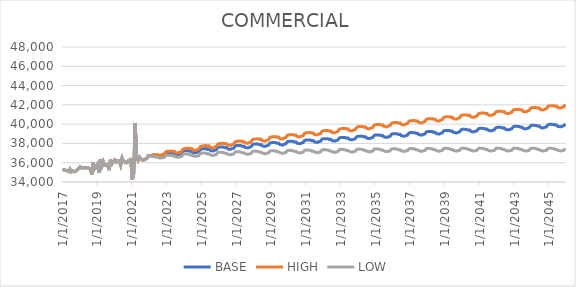
| Category | BASE | HIGH | LOW |
|---|---|---|---|
| 1/1/17 | 35227 | 35227 | 35227 |
| 2/1/17 | 35260 | 35260 | 35260 |
| 3/1/17 | 35215 | 35215 | 35215 |
| 4/1/17 | 35169 | 35169 | 35169 |
| 5/1/17 | 35095 | 35095 | 35095 |
| 6/1/17 | 35328 | 35328 | 35328 |
| 7/1/17 | 35048 | 35048 | 35048 |
| 8/1/17 | 35148 | 35148 | 35148 |
| 9/1/17 | 35068 | 35068 | 35068 |
| 10/1/17 | 35120 | 35120 | 35120 |
| 11/1/17 | 35263 | 35263 | 35263 |
| 12/1/17 | 35378 | 35378 | 35378 |
| 1/1/18 | 35564 | 35564 | 35564 |
| 2/1/18 | 35449 | 35449 | 35449 |
| 3/1/18 | 35502 | 35502 | 35502 |
| 4/1/18 | 35459 | 35459 | 35459 |
| 5/1/18 | 35483 | 35483 | 35483 |
| 6/1/18 | 35495 | 35495 | 35495 |
| 7/1/18 | 35414 | 35414 | 35414 |
| 8/1/18 | 35382 | 35382 | 35382 |
| 9/1/18 | 34801 | 34801 | 34801 |
| 10/1/18 | 36027 | 36027 | 36027 |
| 11/1/18 | 35402 | 35402 | 35402 |
| 12/1/18 | 35638.182 | 35638.182 | 35638.182 |
| 1/1/19 | 35852 | 35852 | 35852 |
| 2/1/19 | 34946 | 34946 | 34946 |
| 3/1/19 | 36319 | 36319 | 36319 |
| 4/1/19 | 35680 | 35680 | 35680 |
| 5/1/19 | 36109 | 36109 | 36109 |
| 6/1/19 | 35726 | 35726 | 35726 |
| 7/1/19 | 35770 | 35770 | 35770 |
| 8/1/19 | 35795 | 35795 | 35795 |
| 9/1/19 | 35242 | 35242 | 35242 |
| 10/1/19 | 36323 | 36323 | 36323 |
| 11/1/19 | 35881 | 35881 | 35881 |
| 12/1/19 | 36100 | 36100 | 36100 |
| 1/1/20 | 36288 | 36288 | 36288 |
| 2/1/20 | 36073 | 36073 | 36073 |
| 3/1/20 | 36222 | 36222 | 36222 |
| 4/1/20 | 36205 | 36205 | 36205 |
| 5/1/20 | 35754 | 35754 | 35754 |
| 6/1/20 | 36479 | 36479 | 36479 |
| 7/1/20 | 36156 | 36156 | 36156 |
| 8/1/20 | 36067 | 36067 | 36067 |
| 9/1/20 | 35987 | 35987 | 35987 |
| 10/1/20 | 36154 | 36154 | 36154 |
| 11/1/20 | 36080 | 36080 | 36080 |
| 12/1/20 | 36480 | 36480 | 36480 |
| 1/1/21 | 34267 | 34267 | 34267 |
| 2/1/21 | 34820 | 34820 | 34820 |
| 3/1/21 | 40112 | 40112 | 40112 |
| 4/1/21 | 36559 | 36559 | 36559 |
| 5/1/21 | 36244 | 36244 | 36244 |
| 6/1/21 | 36578 | 36578 | 36578 |
| 7/1/21 | 36397 | 36397 | 36397 |
| 8/1/21 | 36290 | 36290 | 36290 |
| 9/1/21 | 36292 | 36292 | 36292 |
| 10/1/21 | 36376 | 36376 | 36376 |
| 11/1/21 | 36425 | 36425 | 36425 |
| 12/1/21 | 36745 | 36745 | 36745 |
| 1/1/22 | 36719.5 | 36719.5 | 36719.5 |
| 2/1/22 | 36727.5 | 36727.5 | 36727.5 |
| 3/1/22 | 36744.028 | 36818.098 | 36633.551 |
| 4/1/22 | 36771.654 | 36854.176 | 36648.666 |
| 5/1/22 | 36710.391 | 36801.023 | 36575.361 |
| 6/1/22 | 36754.42 | 36853.437 | 36606.942 |
| 7/1/22 | 36687.809 | 36794.928 | 36528.322 |
| 8/1/22 | 36652.628 | 36767.902 | 36481.031 |
| 9/1/22 | 36660.186 | 36783.818 | 36476.26 |
| 10/1/22 | 36744.545 | 36876.848 | 36547.808 |
| 11/1/22 | 36741.983 | 36882.36 | 36533.27 |
| 12/1/22 | 36939.43 | 37088.857 | 36717.32 |
| 1/1/23 | 37032.223 | 37190.424 | 36797.174 |
| 2/1/23 | 37021.006 | 37187.327 | 36773.901 |
| 3/1/23 | 37029.04 | 37203.759 | 36769.553 |
| 4/1/23 | 37033.798 | 37217.099 | 36761.723 |
| 5/1/23 | 36986.946 | 37178.381 | 36702.899 |
| 6/1/23 | 36989.152 | 37188.872 | 36692.875 |
| 7/1/23 | 36871.953 | 37047.652 | 36616.903 |
| 8/1/23 | 36847.351 | 37031.29 | 36580.147 |
| 9/1/23 | 36847.26 | 37039.643 | 36567.676 |
| 10/1/23 | 36911.061 | 37112.27 | 36618.539 |
| 11/1/23 | 36945.61 | 37155.094 | 36640.868 |
| 12/1/23 | 37165.289 | 37384.466 | 36846.355 |
| 1/1/24 | 37232.916 | 37460.927 | 36901 |
| 2/1/24 | 37235.854 | 37472.038 | 36891.858 |
| 3/1/24 | 37250.831 | 37495.616 | 36894.244 |
| 4/1/24 | 37250.935 | 37504.528 | 36881.524 |
| 5/1/24 | 37174.493 | 37435.843 | 36793.695 |
| 6/1/24 | 37212.734 | 37482.89 | 36819.087 |
| 7/1/24 | 37062.805 | 37308.607 | 36710.901 |
| 8/1/24 | 37049.674 | 37303.912 | 36685.417 |
| 9/1/24 | 37023.465 | 37285.869 | 36647.289 |
| 10/1/24 | 37100.723 | 37372.388 | 36711.078 |
| 11/1/24 | 37146.306 | 37426.423 | 36744.272 |
| 12/1/24 | 37380.976 | 37671.503 | 36963.82 |
| 1/1/25 | 37421.432 | 37720.583 | 36991.624 |
| 2/1/25 | 37447.683 | 37755.327 | 37005.421 |
| 3/1/25 | 37445.571 | 37761.686 | 36990.956 |
| 4/1/25 | 37464.74 | 37790.256 | 36996.595 |
| 5/1/25 | 37375.501 | 37708.472 | 36896.438 |
| 6/1/25 | 37423.503 | 37765.651 | 36931.182 |
| 7/1/25 | 37263.507 | 37581.061 | 36813.327 |
| 8/1/25 | 37236.45 | 37562.275 | 36774.198 |
| 9/1/25 | 37214.509 | 37548.547 | 36740.349 |
| 10/1/25 | 37303.263 | 37647.092 | 36814.998 |
| 11/1/25 | 37337.478 | 37689.559 | 36837.124 |
| 12/1/25 | 37556.332 | 37919.051 | 37040.611 |
| 1/1/26 | 37612.472 | 37984.245 | 37083.562 |
| 2/1/26 | 37621.225 | 38001.187 | 37080.325 |
| 3/1/26 | 37616.289 | 38004.73 | 37063.091 |
| 4/1/26 | 37624.352 | 38022.301 | 37057.563 |
| 5/1/26 | 37556.158 | 37961.865 | 36978.129 |
| 6/1/26 | 37574.251 | 37988.671 | 36983.651 |
| 7/1/26 | 37431.179 | 37821.307 | 36882.403 |
| 8/1/26 | 37400.078 | 37798.387 | 36839.407 |
| 9/1/26 | 37394.149 | 37801.042 | 36821.163 |
| 10/1/26 | 37472.043 | 37888.825 | 36884.883 |
| 11/1/26 | 37499.036 | 37923.887 | 36900.082 |
| 12/1/26 | 37714.155 | 38150.028 | 37099.373 |
| 1/1/27 | 37781.001 | 38226.377 | 37152.492 |
| 2/1/27 | 37778.103 | 38231.341 | 37138.083 |
| 3/1/27 | 37778.957 | 38240.898 | 37126.418 |
| 4/1/27 | 37777.115 | 38248.617 | 37110.998 |
| 5/1/27 | 37703.852 | 38182.885 | 37026.868 |
| 6/1/27 | 37719.971 | 38207.75 | 37030.45 |
| 7/1/27 | 37578.934 | 38042.424 | 36931.308 |
| 8/1/27 | 37554.812 | 38026.672 | 36895.106 |
| 9/1/27 | 37542.86 | 38023.195 | 36871.064 |
| 10/1/27 | 37616.749 | 38107.142 | 36930.619 |
| 11/1/27 | 37653.811 | 38152.505 | 36955.626 |
| 12/1/27 | 37877.836 | 38388.289 | 37162.916 |
| 1/1/28 | 37932.898 | 38452.71 | 37204.479 |
| 2/1/28 | 37938.849 | 38466.729 | 37198.711 |
| 3/1/28 | 37937.85 | 38474.477 | 37185.204 |
| 4/1/28 | 37937.918 | 38484.424 | 37171.353 |
| 5/1/28 | 37854.704 | 38408.32 | 37077.902 |
| 6/1/28 | 37886.785 | 38449.711 | 37096.788 |
| 7/1/28 | 37732.761 | 38270.974 | 36985.294 |
| 8/1/28 | 37709.651 | 38256.267 | 36950.119 |
| 9/1/28 | 37690.696 | 38245.563 | 36919.442 |
| 10/1/28 | 37770.574 | 38335.991 | 36984.411 |
| 11/1/28 | 37807.629 | 38381.348 | 37009.458 |
| 12/1/28 | 38030.687 | 38616.638 | 37215.219 |
| 1/1/29 | 38079.626 | 38674.911 | 37250.743 |
| 2/1/29 | 38088.625 | 38692.038 | 37248 |
| 3/1/29 | 38081.561 | 38693.585 | 37228.67 |
| 4/1/29 | 38086.691 | 38709.044 | 37219.385 |
| 5/1/29 | 38003.438 | 38632.754 | 37126.158 |
| 6/1/29 | 38032.544 | 38671.193 | 37142.114 |
| 7/1/29 | 37879.501 | 38493.375 | 37031.741 |
| 8/1/29 | 37853.398 | 38475.556 | 36993.802 |
| 9/1/29 | 37838.446 | 38469.009 | 36967.012 |
| 10/1/29 | 37918.325 | 38559.768 | 37031.621 |
| 11/1/29 | 37949.375 | 38598.882 | 37051.017 |
| 12/1/29 | 38165.428 | 38827.39 | 37249.542 |
| 1/1/30 | 38221.568 | 38893.281 | 37291.774 |
| 2/1/30 | 38223.552 | 38903.099 | 37282.451 |
| 3/1/30 | 38218.508 | 38906.775 | 37265.07 |
| 4/1/30 | 38217.61 | 38916.246 | 37249.788 |
| 5/1/30 | 38141.383 | 38847.095 | 37163.513 |
| 6/1/30 | 38158.472 | 38873.16 | 37167.998 |
| 7/1/30 | 38013.441 | 38703.573 | 37065.423 |
| 8/1/30 | 37986.328 | 38684.717 | 37026.572 |
| 9/1/30 | 37975.38 | 38682.36 | 37003.627 |
| 10/1/30 | 38053.26 | 38771.333 | 37066.032 |
| 11/1/30 | 38085.311 | 38811.458 | 37086.462 |
| 12/1/30 | 38303.362 | 39042.521 | 37286.327 |
| 1/1/31 | 38358.576 | 39107.643 | 37327.484 |
| 2/1/31 | 38358.566 | 39115.308 | 37316.425 |
| 3/1/31 | 38355.516 | 39121.131 | 37300.904 |
| 4/1/31 | 38354.626 | 39130.846 | 37285.417 |
| 5/1/31 | 38274.387 | 39057.38 | 37195.587 |
| 6/1/31 | 38297.487 | 39089.767 | 37205.755 |
| 7/1/31 | 38147.449 | 38914.921 | 37098.578 |
| 8/1/31 | 38124.342 | 38900.242 | 37063.578 |
| 9/1/31 | 38108.389 | 38892.692 | 37035.939 |
| 10/1/31 | 38186.27 | 38981.971 | 37098.039 |
| 11/1/31 | 38221.322 | 39025.212 | 37121.364 |
| 12/1/31 | 38439.374 | 39256.811 | 37320.6 |
| 1/1/32 | 38492.588 | 39319.963 | 37359.758 |
| 2/1/32 | 38496.576 | 39331.729 | 37352.632 |
| 3/1/32 | 38491.528 | 39335.534 | 37335.218 |
| 4/1/32 | 38491.636 | 39346.565 | 37320.408 |
| 5/1/32 | 38409.401 | 39270.832 | 37228.997 |
| 6/1/32 | 38437.496 | 39308.564 | 37243.794 |
| 7/1/32 | 38284.462 | 39130.495 | 37133.985 |
| 8/1/32 | 38258.352 | 39112.671 | 37096.203 |
| 9/1/32 | 38242.401 | 39105.116 | 37068.671 |
| 10/1/32 | 38322.281 | 39196.788 | 37132.342 |
| 11/1/32 | 38354.333 | 39236.911 | 37152.854 |
| 12/1/32 | 38572.385 | 39468.977 | 37351.574 |
| 1/1/33 | 38624.645 | 39531.275 | 37389.699 |
| 2/1/33 | 38628.633 | 39542.997 | 37382.665 |
| 3/1/33 | 38620.585 | 39543.705 | 37362.438 |
| 4/1/33 | 38621.694 | 39556.027 | 37348.365 |
| 5/1/33 | 38540.458 | 39481.205 | 37258.116 |
| 6/1/33 | 38564.554 | 39514.826 | 37269.139 |
| 7/1/33 | 38415.518 | 39340.874 | 37163.268 |
| 8/1/33 | 38387.41 | 39320.979 | 37123.65 |
| 9/1/33 | 38373.458 | 39315.527 | 37098.069 |
| 10/1/33 | 38450.339 | 39404.381 | 37158.567 |
| 11/1/33 | 38482.39 | 39444.455 | 37179.198 |
| 12/1/33 | 38698.442 | 39674.888 | 37375.52 |
| 1/1/34 | 38753.851 | 39740.664 | 37416.424 |
| 2/1/34 | 38755.839 | 39750.203 | 37407.673 |
| 3/1/34 | 38749.791 | 39753.047 | 37389.343 |
| 4/1/34 | 38747.9 | 39762.468 | 37372.22 |
| 5/1/34 | 38668.664 | 39689.587 | 37284.129 |
| 6/1/34 | 38689.76 | 39720.162 | 37292.298 |
| 7/1/34 | 38541.725 | 39547.177 | 37187.519 |
| 8/1/34 | 38515.616 | 39529.376 | 37149.862 |
| 9/1/34 | 38500.664 | 39522.923 | 37123.346 |
| 10/1/34 | 38576.545 | 39610.995 | 37182.661 |
| 11/1/34 | 38608.597 | 39651.039 | 37203.372 |
| 12/1/34 | 38825.648 | 39883.012 | 37400.064 |
| 1/1/35 | 38880.001 | 39947.853 | 37439.837 |
| 2/1/35 | 38881.989 | 39957.319 | 37431.228 |
| 3/1/35 | 38875.941 | 39960.23 | 37412.879 |
| 4/1/35 | 38874.05 | 39969.898 | 37395.538 |
| 5/1/35 | 38792.814 | 39894.733 | 37305.869 |
| 6/1/35 | 38815.91 | 39927.524 | 37315.85 |
| 7/1/35 | 38665.874 | 39752.335 | 37209.399 |
| 8/1/35 | 38639.766 | 39734.559 | 37171.757 |
| 9/1/35 | 38622.814 | 39726.01 | 37143.47 |
| 10/1/35 | 38700.695 | 39816.492 | 37204.352 |
| 11/1/35 | 38732.747 | 39856.529 | 37225.092 |
| 12/1/35 | 38949.798 | 40088.985 | 37421.267 |
| 1/1/36 | 39001.491 | 40151.156 | 37458.397 |
| 2/1/36 | 39004.491 | 40161.629 | 37450.856 |
| 3/1/36 | 38997.491 | 40163.569 | 37431.697 |
| 4/1/36 | 38998.491 | 40176.529 | 37416.816 |
| 5/1/36 | 38914.491 | 40098.313 | 37324.822 |
| 6/1/36 | 38938.956 | 40132.599 | 37336.066 |
| 7/1/36 | 38787.92 | 39956.286 | 37228.874 |
| 8/1/36 | 38761.812 | 39938.486 | 37191.327 |
| 9/1/36 | 38744.86 | 39929.943 | 37163.116 |
| 10/1/36 | 38821.741 | 40019.71 | 37222.698 |
| 11/1/36 | 38852.793 | 40058.617 | 37242.66 |
| 12/1/36 | 39070.491 | 40292.261 | 37438.898 |
| 1/1/37 | 39121.128 | 40353.447 | 37474.931 |
| 2/1/37 | 39123.128 | 40362.773 | 37466.62 |
| 3/1/37 | 39117.128 | 40365.798 | 37448.373 |
| 4/1/37 | 39116.128 | 40376.922 | 37431.415 |
| 5/1/37 | 39035.128 | 40301.731 | 37342.434 |
| 6/1/37 | 39057.128 | 40333.472 | 37351.418 |
| 7/1/37 | 38905.897 | 40156.899 | 37244.177 |
| 8/1/37 | 38878.789 | 40138.02 | 37205.811 |
| 9/1/37 | 38861.837 | 40129.451 | 37177.68 |
| 10/1/37 | 38939.718 | 40220.603 | 37237.9 |
| 11/1/37 | 38970.128 | 40258.795 | 37257.305 |
| 12/1/37 | 39186.128 | 40491.086 | 37451.475 |
| 1/1/38 | 39238.74 | 40554.576 | 37489.179 |
| 2/1/38 | 39239.74 | 40562.717 | 37480.167 |
| 3/1/38 | 39231.74 | 40563.681 | 37460.038 |
| 4/1/38 | 39230.74 | 40575.028 | 37442.924 |
| 5/1/38 | 39147.74 | 40497.541 | 37352.349 |
| 6/1/38 | 39170.74 | 40530.445 | 37362.214 |
| 7/1/38 | 39020.74 | 40355.081 | 37256.313 |
| 8/1/38 | 38991.74 | 40334.174 | 37216.259 |
| 9/1/38 | 38975.74 | 40326.668 | 37189.059 |
| 10/1/38 | 39052.74 | 40417.141 | 37248.19 |
| 11/1/38 | 39083.74 | 40455.913 | 37268.279 |
| 12/1/38 | 39299.74 | 40688.746 | 37461.871 |
| 1/1/39 | 39352.479 | 40752.487 | 37499.542 |
| 2/1/39 | 39353.479 | 40760.571 | 37490.622 |
| 3/1/39 | 39346.479 | 40762.596 | 37471.511 |
| 4/1/39 | 39344.479 | 40773.139 | 37453.232 |
| 5/1/39 | 39260.479 | 40694.428 | 37362.073 |
| 6/1/39 | 39283.479 | 40727.418 | 37371.915 |
| 7/1/39 | 39131.479 | 40549.83 | 37264.339 |
| 8/1/39 | 39105.479 | 40532.106 | 37227.149 |
| 9/1/39 | 39086.479 | 40521.377 | 37197.281 |
| 10/1/39 | 39163.479 | 40612.154 | 37256.143 |
| 11/1/39 | 39193.479 | 40649.861 | 37275.361 |
| 12/1/39 | 39410.479 | 40884.169 | 37469.436 |
| 1/1/40 | 39462.292 | 40947.046 | 37506.151 |
| 2/1/40 | 39464.292 | 40956.134 | 37498.273 |
| 3/1/40 | 39455.292 | 40956.114 | 37477.297 |
| 4/1/40 | 39452.292 | 40965.814 | 37457.925 |
| 5/1/40 | 39370.292 | 40888.97 | 37368.915 |
| 6/1/40 | 39392.292 | 40921.022 | 37377.778 |
| 7/1/40 | 39240.292 | 40743.342 | 37270.385 |
| 8/1/40 | 39212.292 | 40723.494 | 37231.384 |
| 9/1/40 | 39194.292 | 40713.817 | 37202.557 |
| 10/1/40 | 39271.292 | 40804.865 | 37261.173 |
| 11/1/40 | 39300.292 | 40841.467 | 37279.529 |
| 12/1/40 | 39516.292 | 41075.199 | 37472.164 |
| 1/1/41 | 39567.158 | 41137.218 | 37507.937 |
| 2/1/41 | 39568.158 | 41145.128 | 37499.32 |
| 3/1/41 | 39559.158 | 41145.137 | 37478.375 |
| 4/1/41 | 39559.158 | 41158.297 | 37461.574 |
| 5/1/41 | 39475.158 | 41079.154 | 37370.957 |
| 6/1/41 | 39496.158 | 41110.193 | 37378.919 |
| 7/1/41 | 39345.158 | 40933.482 | 37272.662 |
| 8/1/41 | 39318.158 | 40914.682 | 37234.666 |
| 9/1/41 | 39300.158 | 40905.001 | 37205.926 |
| 10/1/41 | 39375.158 | 40994.298 | 37262.311 |
| 11/1/41 | 39405.158 | 41031.84 | 37281.782 |
| 12/1/41 | 39621.158 | 41266.054 | 37473.914 |
| 1/1/42 | 39671.837 | 41328.053 | 37509.294 |
| 2/1/42 | 39672.837 | 41335.875 | 37500.828 |
| 3/1/42 | 39665.837 | 41338.003 | 37481.792 |
| 4/1/42 | 39661.837 | 41347.163 | 37461.082 |
| 5/1/42 | 39578.837 | 41268.94 | 37371.713 |
| 6/1/42 | 39599.837 | 41300.017 | 37379.642 |
| 7/1/42 | 39447.837 | 41122.191 | 37272.64 |
| 8/1/42 | 39420.837 | 41103.345 | 37234.791 |
| 9/1/42 | 39402.837 | 41093.695 | 37206.066 |
| 10/1/42 | 39478.837 | 41184.359 | 37263.122 |
| 11/1/42 | 39507.837 | 41220.783 | 37281.738 |
| 12/1/42 | 39723.837 | 41455.481 | 37473.369 |
| 1/1/43 | 39774.691 | 41517.804 | 37508.791 |
| 2/1/43 | 39775.691 | 41525.537 | 37500.475 |
| 3/1/43 | 39767.691 | 41526.672 | 37480.515 |
| 4/1/43 | 39765.691 | 41538.17 | 37461.514 |
| 5/1/43 | 39683.691 | 41460.83 | 37373.244 |
| 6/1/43 | 39704.691 | 41492.027 | 37381.183 |
| 7/1/43 | 39552.691 | 41314.029 | 37274.416 |
| 8/1/43 | 39523.691 | 41293.113 | 37234.701 |
| 9/1/43 | 39506.691 | 41284.448 | 37207.084 |
| 10/1/43 | 39580.691 | 41373.24 | 37262.044 |
| 11/1/43 | 39611.691 | 41411.787 | 37282.572 |
| 12/1/43 | 39827.691 | 41647.013 | 37473.672 |
| 1/1/44 | 39876.414 | 41707.125 | 37507.165 |
| 2/1/44 | 39878.414 | 41715.838 | 37499.917 |
| 3/1/44 | 39868.414 | 41714.824 | 37478.199 |
| 4/1/44 | 39866.414 | 41726.609 | 37458.933 |
| 5/1/44 | 39783.414 | 41648.023 | 37370.057 |
| 6/1/44 | 39805.414 | 41680.326 | 37378.936 |
| 7/1/44 | 39653.414 | 41502.355 | 37272.196 |
| 8/1/44 | 39625.414 | 41482.411 | 37233.588 |
| 9/1/44 | 39607.414 | 41472.754 | 37205.031 |
| 10/1/44 | 39685.414 | 41566.216 | 37263.312 |
| 11/1/44 | 39715.414 | 41603.644 | 37282.982 |
| 12/1/44 | 39931.414 | 41839.401 | 37473.535 |
| 1/1/45 | 39983.095 | 41902.945 | 37509.412 |
| 2/1/45 | 39983.095 | 41909.384 | 37500.531 |
| 3/1/45 | 39975.095 | 41910.627 | 37480.574 |
| 4/1/45 | 39974.095 | 41923.74 | 37462.055 |
| 5/1/45 | 39890.095 | 41843.947 | 37372.529 |
| 6/1/45 | 39913.095 | 41877.491 | 37382.146 |
| 7/1/45 | 39763.095 | 41701.584 | 37277.494 |
| 8/1/45 | 39735.095 | 41681.759 | 37238.799 |
| 9/1/45 | 39719.095 | 41674.296 | 37212.123 |
| 10/1/45 | 39796.095 | 41767.003 | 37269.174 |
| 11/1/45 | 39829.095 | 41807.698 | 37291.587 |
| 12/1/45 | 40045.095 | 42043.954 | 37481.638 |